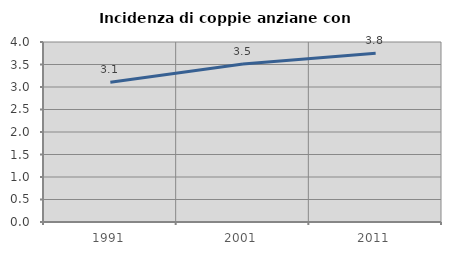
| Category | Incidenza di coppie anziane con figli |
|---|---|
| 1991.0 | 3.105 |
| 2001.0 | 3.512 |
| 2011.0 | 3.751 |